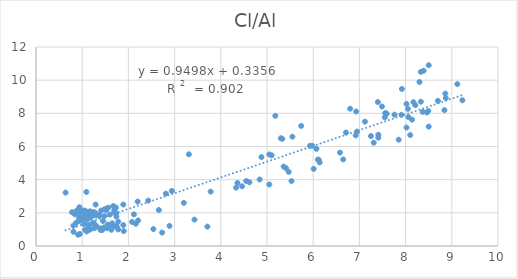
| Category | Cl/Al |
|---|---|
| 8.14 | 7.62 |
| 7.56 | 8.02 |
| 6.58 | 5.63 |
| 5.05 | 3.71 |
| 5.98 | 6.05 |
| 5.53 | 3.92 |
| 8.1 | 6.69 |
| 5.93 | 6.04 |
| 7.25 | 6.63 |
| 8.5 | 7.2 |
| 4.46 | 3.6 |
| 7.41 | 6.71 |
| 8.84 | 8.19 |
| 2.43 | 2.74 |
| 6.14 | 5.04 |
| 4.84 | 4.01 |
| 5.36 | 4.79 |
| 5.41 | 4.7 |
| 6.12 | 5.2 |
| 5.55 | 6.59 |
| 1.13 | 1.85 |
| 1.29 | 2.5 |
| 5.18 | 7.85 |
| 0.99 | 1.92 |
| 1.12 | 2.01 |
| 1.69 | 2.14 |
| 0.84 | 1.92 |
| 1.24 | 1.96 |
| 1.18 | 1.92 |
| 1.06 | 2.13 |
| 1.08 | 1.57 |
| 1.2 | 1.77 |
| 0.93 | 1.51 |
| 1.04 | 2.13 |
| 0.98 | 2.14 |
| 1.49 | 2.23 |
| 1.09 | 1.61 |
| 1.56 | 2.31 |
| 0.87 | 1.4 |
| 1.01 | 1.67 |
| 1.14 | 1.66 |
| 0.91 | 1.99 |
| 1.05 | 1.73 |
| 1.03 | 1.96 |
| 1.48 | 1.81 |
| 0.88 | 2.13 |
| 1.45 | 1.51 |
| 1.1 | 2.06 |
| 0.93 | 1.72 |
| 1.17 | 2.09 |
| 6.92 | 6.67 |
| 7.12 | 7.5 |
| 7.76 | 7.92 |
| 4.88 | 5.36 |
| 8.49 | 8.14 |
| 8.37 | 8.09 |
| 8.3 | 9.89 |
| 7.59 | 7.98 |
| 8.02 | 7.14 |
| 8.7 | 8.75 |
| 8.33 | 10.5 |
| 7.55 | 7.76 |
| 7.91 | 7.91 |
| 6.07 | 5.86 |
| 5.74 | 7.24 |
| 6.1 | 5.21 |
| 8.06 | 7.77 |
| 5.1 | 5.47 |
| 5.33 | 6.46 |
| 8.05 | 8.27 |
| 1.6 | 1.9 |
| 2.08 | 1.45 |
| 2.2 | 2.68 |
| 1.72 | 2 |
| 3.2 | 2.6 |
| 0.81 | 1.23 |
| 3.31 | 5.53 |
| 1.06 | 2.03 |
| 4.33 | 3.52 |
| 2.81 | 3.16 |
| 7.85 | 6.41 |
| 1.37 | 1.81 |
| 1.52 | 2.16 |
| 1.3 | 1.84 |
| 2.94 | 3.32 |
| 0.94 | 2.34 |
| 1.03 | 1.77 |
| 4.62 | 3.84 |
| 1.73 | 1.94 |
| 1.89 | 2.5 |
| 3.43 | 1.59 |
| 1.29 | 1.98 |
| 1.41 | 2.14 |
| 1.25 | 2.05 |
| 1.67 | 2.41 |
| 1.04 | 1.89 |
| 1.04 | 1.88 |
| 1.09 | 3.26 |
| 1.0 | 2 |
| 1.18 | 1.72 |
| 7.4 | 8.68 |
| 7.31 | 6.23 |
| 7.49 | 8.41 |
| 6.01 | 4.65 |
| 8.5 | 10.9 |
| 7.92 | 9.47 |
| 6.95 | 6.9 |
| 9.23 | 8.79 |
| 9.12 | 9.76 |
| 8.87 | 8.92 |
| 8.17 | 8.67 |
| 8.39 | 10.57 |
| 8.86 | 9.19 |
| 8.02 | 8.57 |
| 6.93 | 8.11 |
| 8.33 | 8.7 |
| 6.65 | 5.22 |
| 6.8 | 8.28 |
| 8.46 | 8.05 |
| 5.3 | 6.5 |
| 0.93 | 2.07 |
| 0.95 | 1.57 |
| 0.91 | 0.68 |
| 1.1 | 0.88 |
| 1.39 | 1.06 |
| 1.06 | 0.97 |
| 1.43 | 0.98 |
| 1.22 | 1.36 |
| 1.03 | 1.33 |
| 1.14 | 1.11 |
| 2.54 | 1.02 |
| 0.81 | 0.86 |
| 1.47 | 1.12 |
| 2.73 | 0.81 |
| 2.21 | 1.54 |
| 1.13 | 1.24 |
| 1.06 | 2.01 |
| 1.44 | 0.99 |
| 4.36 | 3.8 |
| 1.26 | 1.07 |
| 7.41 | 6.53 |
| 1.3 | 1.22 |
| 1.72 | 2.02 |
| 1.17 | 0.99 |
| 0.64 | 3.22 |
| 1.9 | 0.9 |
| 1.39 | 1.04 |
| 1.55 | 1.29 |
| 0.78 | 2.04 |
| 0.95 | 0.73 |
| 5.05 | 5.52 |
| 5.47 | 4.47 |
| 8.21 | 8.49 |
| 6.71 | 6.84 |
| 3.78 | 3.28 |
| 1.73 | 2.32 |
| 2.12 | 1.91 |
| 1.89 | 1.26 |
| 1.75 | 1.12 |
| 1.25 | 1.39 |
| 1.23 | 1.35 |
| 1.74 | 1.21 |
| 1.66 | 1.17 |
| 1.62 | 1.29 |
| 1.74 | 1.77 |
| 2.16 | 1.34 |
| 1.4 | 0.96 |
| 2.89 | 1.21 |
| 1.78 | 1 |
| 4.55 | 3.92 |
| 1.65 | 1.37 |
| 3.71 | 1.17 |
| 1.63 | 0.98 |
| 1.78 | 1.47 |
| 1.54 | 1.07 |
| 1.37 | 1.88 |
| 2.66 | 2.17 |